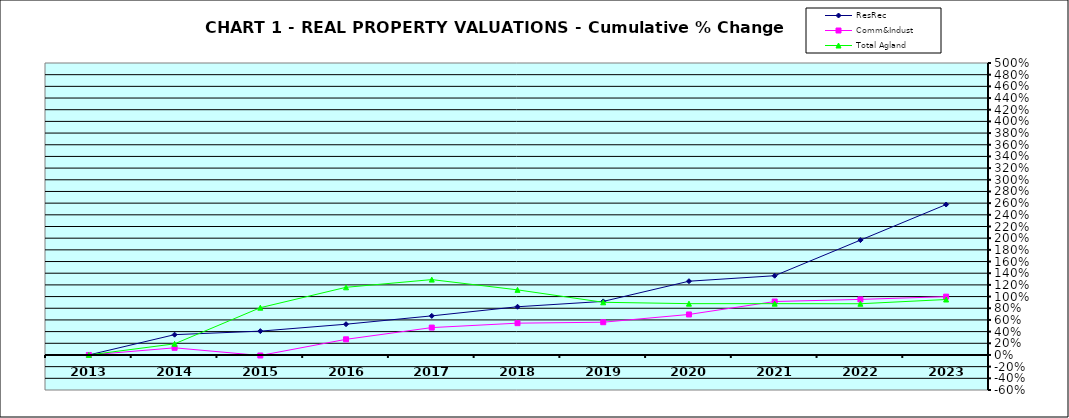
| Category | ResRec | Comm&Indust | Total Agland |
|---|---|---|---|
| 2013.0 | 0 | 0 | 0 |
| 2014.0 | 0.348 | 0.122 | 0.191 |
| 2015.0 | 0.408 | -0.009 | 0.81 |
| 2016.0 | 0.527 | 0.268 | 1.159 |
| 2017.0 | 0.67 | 0.469 | 1.291 |
| 2018.0 | 0.826 | 0.545 | 1.115 |
| 2019.0 | 0.917 | 0.561 | 0.902 |
| 2020.0 | 1.263 | 0.694 | 0.879 |
| 2021.0 | 1.357 | 0.915 | 0.878 |
| 2022.0 | 1.967 | 0.952 | 0.877 |
| 2023.0 | 2.576 | 0.999 | 0.95 |